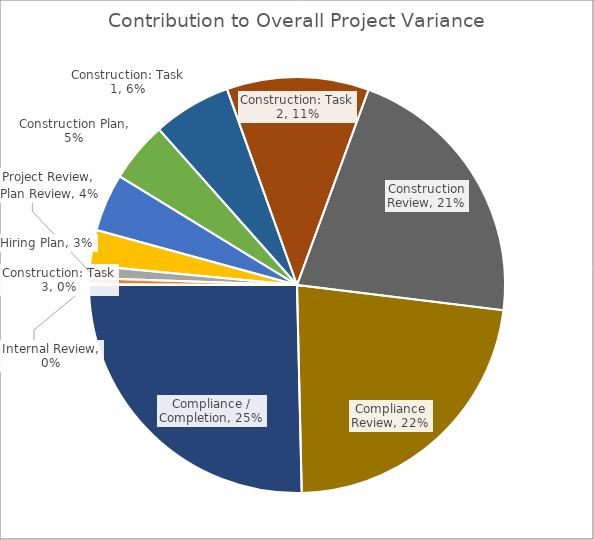
| Category | Series 0 |
|---|---|
| Internal Review | 0.001 |
| Construction: Task 3 | 0.004 |
| Project Review | 0.009 |
| Hiring Plan | 0.027 |
| Plan Review | 0.043 |
| Construction Plan | 0.046 |
| Construction: Task 1 | 0.059 |
| Construction: Task 2 | 0.107 |
| Construction Review | 0.207 |
| Compliance Review | 0.22 |
| Compliance / Completion | 0.246 |